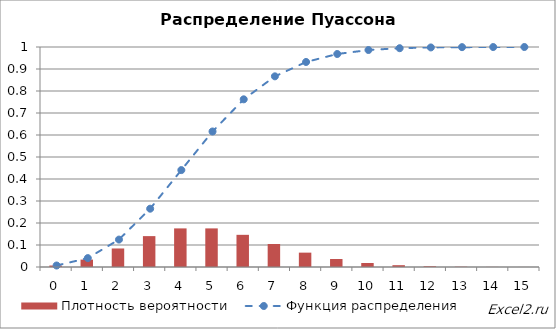
| Category | Плотность вероятности |
|---|---|
| 0.0 | 0.007 |
| 1.0 | 0.034 |
| 2.0 | 0.084 |
| 3.0 | 0.14 |
| 4.0 | 0.175 |
| 5.0 | 0.175 |
| 6.0 | 0.146 |
| 7.0 | 0.104 |
| 8.0 | 0.065 |
| 9.0 | 0.036 |
| 10.0 | 0.018 |
| 11.0 | 0.008 |
| 12.0 | 0.003 |
| 13.0 | 0.001 |
| 14.0 | 0 |
| 15.0 | 0 |